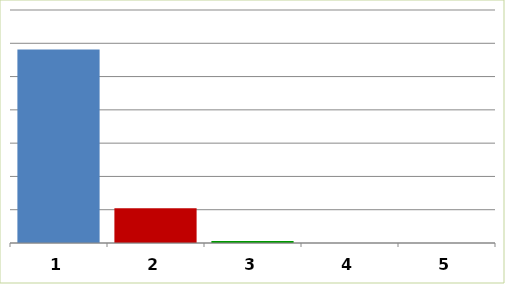
| Category | Series 0 |
|---|---|
| 0 | 58166007.04 |
| 1 | 10408629.47 |
| 2 | 572057 |
| 3 | 0 |
| 4 | 0 |